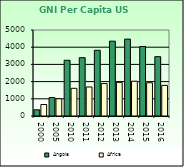
| Category | Angola | Africa                        |
|---|---|---|
| 2000.0 | 360 | 668.557 |
| 2005.0 | 1070 | 1002.896 |
| 2010.0 | 3240 | 1608.999 |
| 2011.0 | 3390 | 1686.521 |
| 2012.0 | 3820 | 1885.129 |
| 2013.0 | 4350 | 1956.671 |
| 2014.0 | 4470 | 2022.289 |
| 2015.0 | 4040 | 1932.283 |
| 2016.0 | 3450 | 1781.415 |